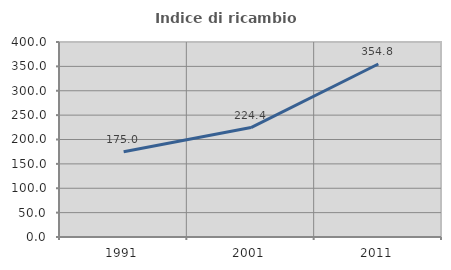
| Category | Indice di ricambio occupazionale  |
|---|---|
| 1991.0 | 175 |
| 2001.0 | 224.444 |
| 2011.0 | 354.839 |